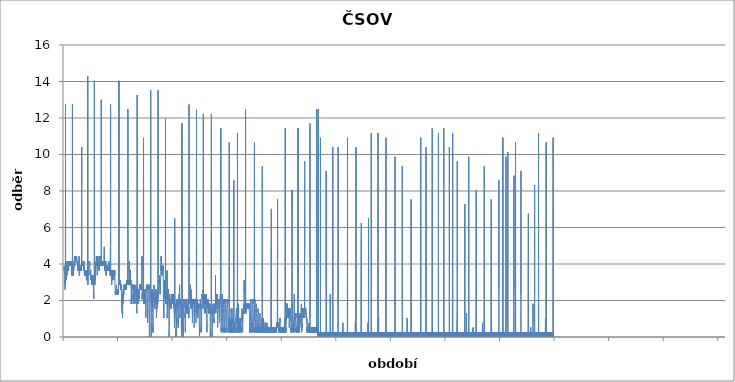
| Category | Series 0 |
|---|---|
|  | 3.64 |
|  | 3.64 |
|  | 3.9 |
|  | 3.9 |
|  | 3.64 |
|  | 3.64 |
|  | 3.64 |
|  | 3.64 |
|  | 3.38 |
|  | 3.38 |
|  | 3.38 |
|  | 3.38 |
|  | 2.86 |
|  | 3.12 |
|  | 2.86 |
|  | 2.6 |
|  | 2.86 |
|  | 2.86 |
|  | 2.86 |
|  | 3.12 |
|  | 12.74 |
|  | 3.9 |
|  | 3.12 |
|  | 3.12 |
|  | 3.12 |
|  | 3.12 |
|  | 3.12 |
|  | 3.38 |
|  | 3.38 |
|  | 3.12 |
|  | 3.12 |
|  | 3.38 |
|  | 3.12 |
|  | 3.12 |
|  | 4.16 |
|  | 3.9 |
|  | 3.38 |
|  | 3.64 |
|  | 3.38 |
|  | 3.64 |
|  | 3.64 |
|  | 3.64 |
|  | 3.64 |
|  | 3.64 |
|  | 3.64 |
|  | 3.9 |
|  | 3.64 |
|  | 3.9 |
|  | 3.9 |
|  | 3.9 |
|  | 3.64 |
|  | 3.9 |
|  | 3.9 |
|  | 3.9 |
|  | 3.9 |
|  | 4.16 |
|  | 3.9 |
|  | 3.9 |
|  | 3.9 |
|  | 3.64 |
|  | 3.9 |
|  | 3.64 |
|  | 3.9 |
|  | 3.9 |
|  | 3.9 |
|  | 3.9 |
|  | 3.9 |
|  | 4.16 |
|  | 3.9 |
|  | 4.16 |
|  | 3.9 |
|  | 4.16 |
|  | 3.9 |
|  | 4.16 |
|  | 4.16 |
|  | 4.16 |
|  | 3.9 |
|  | 4.16 |
|  | 4.16 |
|  | 4.16 |
|  | 4.16 |
|  | 4.16 |
|  | 4.16 |
|  | 3.9 |
|  | 3.9 |
|  | 4.16 |
|  | 3.9 |
|  | 4.16 |
|  | 4.16 |
|  | 4.16 |
|  | 4.16 |
|  | 4.16 |
|  | 4.16 |
|  | 4.16 |
|  | 4.16 |
|  | 3.9 |
|  | 4.16 |
|  | 4.16 |
|  | 3.9 |
|  | 4.16 |
|  | 3.9 |
|  | 4.16 |
|  | 3.9 |
|  | 3.9 |
|  | 3.9 |
|  | 3.64 |
|  | 3.9 |
|  | 3.38 |
|  | 3.64 |
|  | 3.38 |
|  | 3.38 |
|  | 3.38 |
|  | 3.64 |
|  | 12.74 |
|  | 5.46 |
|  | 3.64 |
|  | 3.38 |
|  | 3.64 |
|  | 3.64 |
|  | 3.38 |
|  | 3.64 |
|  | 3.38 |
|  | 3.64 |
|  | 3.64 |
|  | 3.64 |
|  | 3.9 |
|  | 3.64 |
|  | 3.64 |
|  | 3.9 |
|  | 3.64 |
|  | 3.64 |
|  | 3.64 |
|  | 3.64 |
|  | 3.9 |
|  | 3.9 |
|  | 3.9 |
|  | 3.9 |
|  | 4.16 |
|  | 3.9 |
|  | 4.16 |
|  | 3.9 |
|  | 3.9 |
|  | 4.16 |
|  | 3.9 |
|  | 4.42 |
|  | 4.16 |
|  | 4.16 |
|  | 4.42 |
|  | 4.16 |
|  | 4.16 |
|  | 4.42 |
|  | 4.16 |
|  | 4.16 |
|  | 4.16 |
|  | 4.16 |
|  | 4.42 |
|  | 4.16 |
|  | 4.16 |
|  | 4.42 |
|  | 4.42 |
|  | 4.16 |
|  | 4.16 |
|  | 4.42 |
|  | 4.16 |
|  | 4.42 |
|  | 4.16 |
|  | 4.42 |
|  | 4.16 |
|  | 4.16 |
|  | 4.42 |
|  | 4.16 |
|  | 4.16 |
|  | 4.16 |
|  | 4.16 |
|  | 4.16 |
|  | 4.16 |
|  | 4.16 |
|  | 4.16 |
|  | 4.16 |
|  | 4.16 |
|  | 4.16 |
|  | 3.9 |
|  | 4.16 |
|  | 3.9 |
|  | 3.9 |
|  | 3.9 |
|  | 3.9 |
|  | 3.9 |
|  | 3.64 |
|  | 3.9 |
|  | 3.64 |
|  | 3.9 |
|  | 3.64 |
|  | 3.64 |
|  | 3.64 |
|  | 3.64 |
|  | 3.9 |
|  | 3.64 |
|  | 3.64 |
|  | 3.64 |
|  | 3.64 |
|  | 3.64 |
|  | 3.64 |
|  | 4.42 |
|  | 3.64 |
|  | 3.38 |
|  | 3.38 |
|  | 3.64 |
|  | 3.38 |
|  | 3.64 |
|  | 3.64 |
|  | 3.64 |
|  | 3.9 |
|  | 3.64 |
|  | 3.64 |
|  | 3.64 |
|  | 3.64 |
|  | 3.9 |
|  | 3.64 |
|  | 3.9 |
|  | 3.64 |
|  | 3.64 |
|  | 3.64 |
|  | 3.64 |
|  | 3.64 |
|  | 3.64 |
|  | 3.64 |
|  | 3.64 |
|  | 3.9 |
|  | 3.64 |
|  | 3.9 |
|  | 3.9 |
|  | 3.64 |
|  | 3.9 |
|  | 3.64 |
|  | 3.9 |
|  | 3.9 |
|  | 10.4 |
|  | 8.32 |
|  | 4.16 |
|  | 3.9 |
|  | 3.9 |
|  | 4.16 |
|  | 3.9 |
|  | 4.16 |
|  | 4.16 |
|  | 3.9 |
|  | 4.16 |
|  | 4.16 |
|  | 4.16 |
|  | 3.9 |
|  | 4.16 |
|  | 3.9 |
|  | 4.16 |
|  | 3.9 |
|  | 4.16 |
|  | 4.16 |
|  | 3.9 |
|  | 4.16 |
|  | 4.16 |
|  | 4.16 |
|  | 4.16 |
|  | 4.16 |
|  | 4.16 |
|  | 4.16 |
|  | 3.9 |
|  | 4.16 |
|  | 3.64 |
|  | 3.9 |
|  | 3.9 |
|  | 3.64 |
|  | 3.64 |
|  | 3.64 |
|  | 3.64 |
|  | 3.38 |
|  | 3.38 |
|  | 3.38 |
|  | 3.38 |
|  | 3.38 |
|  | 3.38 |
|  | 3.38 |
|  | 3.38 |
|  | 3.64 |
|  | 3.64 |
|  | 3.64 |
|  | 3.38 |
|  | 3.64 |
|  | 3.38 |
|  | 3.64 |
|  | 3.38 |
|  | 3.64 |
|  | 3.64 |
|  | 3.38 |
|  | 3.38 |
|  | 3.64 |
|  | 3.38 |
|  | 3.38 |
|  | 3.64 |
|  | 3.38 |
|  | 3.38 |
|  | 3.12 |
|  | 3.12 |
|  | 3.12 |
|  | 3.38 |
|  | 3.12 |
|  | 3.38 |
|  | 3.38 |
|  | 3.12 |
|  | 3.12 |
|  | 3.38 |
|  | 3.12 |
|  | 3.38 |
|  | 3.38 |
|  | 3.12 |
|  | 3.12 |
|  | 3.38 |
|  | 3.12 |
|  | 14.3 |
|  | 3.12 |
|  | 3.12 |
|  | 2.86 |
|  | 3.12 |
|  | 3.12 |
|  | 3.12 |
|  | 3.12 |
|  | 3.12 |
|  | 3.38 |
|  | 3.38 |
|  | 3.64 |
|  | 3.64 |
|  | 3.64 |
|  | 3.64 |
|  | 3.9 |
|  | 3.9 |
|  | 3.9 |
|  | 3.9 |
|  | 4.16 |
|  | 4.16 |
|  | 4.16 |
|  | 4.16 |
|  | 3.9 |
|  | 4.16 |
|  | 3.9 |
|  | 4.16 |
|  | 3.9 |
|  | 3.9 |
|  | 3.9 |
|  | 3.9 |
|  | 3.64 |
|  | 3.64 |
|  | 3.38 |
|  | 3.38 |
|  | 3.64 |
|  | 3.38 |
|  | 3.64 |
|  | 3.38 |
|  | 3.38 |
|  | 3.64 |
|  | 3.38 |
|  | 3.12 |
|  | 3.12 |
|  | 3.12 |
|  | 3.12 |
|  | 3.38 |
|  | 3.38 |
|  | 3.12 |
|  | 3.38 |
|  | 3.38 |
|  | 3.38 |
|  | 3.38 |
|  | 3.12 |
|  | 3.12 |
|  | 2.86 |
|  | 3.12 |
|  | 2.86 |
|  | 3.12 |
|  | 2.86 |
|  | 3.38 |
|  | 3.12 |
|  | 3.12 |
|  | 3.38 |
|  | 3.38 |
|  | 3.12 |
|  | 3.38 |
|  | 3.38 |
|  | 3.38 |
|  | 3.12 |
|  | 3.38 |
|  | 3.38 |
|  | 3.12 |
|  | 3.12 |
|  | 3.38 |
|  | 3.12 |
|  | 3.12 |
|  | 3.12 |
|  | 2.6 |
|  | 2.6 |
|  | 2.34 |
|  | 2.08 |
|  | 2.6 |
|  | 2.6 |
|  | 2.86 |
|  | 2.86 |
|  | 3.12 |
|  | 2.86 |
|  | 3.12 |
|  | 2.86 |
|  | 14.04 |
|  | 2.86 |
|  | 2.86 |
|  | 3.12 |
|  | 3.12 |
|  | 3.12 |
|  | 2.86 |
|  | 3.12 |
|  | 3.12 |
|  | 3.12 |
|  | 3.9 |
|  | 3.38 |
|  | 3.12 |
|  | 3.38 |
|  | 3.12 |
|  | 3.38 |
|  | 3.38 |
|  | 3.64 |
|  | 3.64 |
|  | 3.64 |
|  | 3.9 |
|  | 3.9 |
|  | 4.16 |
|  | 3.9 |
|  | 4.16 |
|  | 4.16 |
|  | 4.42 |
|  | 4.16 |
|  | 4.16 |
|  | 4.16 |
|  | 4.16 |
|  | 4.42 |
|  | 4.16 |
|  | 4.42 |
|  | 4.16 |
|  | 3.9 |
|  | 3.64 |
|  | 3.64 |
|  | 3.38 |
|  | 3.38 |
|  | 3.64 |
|  | 3.9 |
|  | 3.9 |
|  | 4.16 |
|  | 4.16 |
|  | 3.9 |
|  | 4.16 |
|  | 4.42 |
|  | 4.16 |
|  | 4.16 |
|  | 4.16 |
|  | 4.16 |
|  | 4.16 |
|  | 4.16 |
|  | 4.16 |
|  | 3.9 |
|  | 4.16 |
|  | 4.16 |
|  | 3.9 |
|  | 3.9 |
|  | 3.9 |
|  | 3.9 |
|  | 3.64 |
|  | 3.9 |
|  | 3.64 |
|  | 3.9 |
|  | 3.9 |
|  | 3.9 |
|  | 4.16 |
|  | 3.9 |
|  | 4.16 |
|  | 4.42 |
|  | 4.16 |
|  | 4.16 |
|  | 4.16 |
|  | 4.16 |
|  | 4.42 |
|  | 4.16 |
|  | 4.16 |
|  | 3.9 |
|  | 4.16 |
|  | 3.9 |
|  | 4.16 |
|  | 3.9 |
|  | 4.16 |
|  | 4.16 |
|  | 3.9 |
|  | 4.16 |
|  | 4.16 |
|  | 3.9 |
|  | 4.16 |
|  | 4.16 |
|  | 13 |
|  | 6.5 |
|  | 4.16 |
|  | 4.16 |
|  | 4.16 |
|  | 4.16 |
|  | 3.9 |
|  | 4.16 |
|  | 4.16 |
|  | 3.9 |
|  | 3.9 |
|  | 4.16 |
|  | 3.9 |
|  | 4.16 |
|  | 4.16 |
|  | 4.16 |
|  | 4.16 |
|  | 3.9 |
|  | 3.9 |
|  | 3.9 |
|  | 3.9 |
|  | 3.9 |
|  | 3.9 |
|  | 4.16 |
|  | 4.16 |
|  | 4.16 |
|  | 4.16 |
|  | 4.16 |
|  | 4.16 |
|  | 4.16 |
|  | 4.16 |
|  | 4.16 |